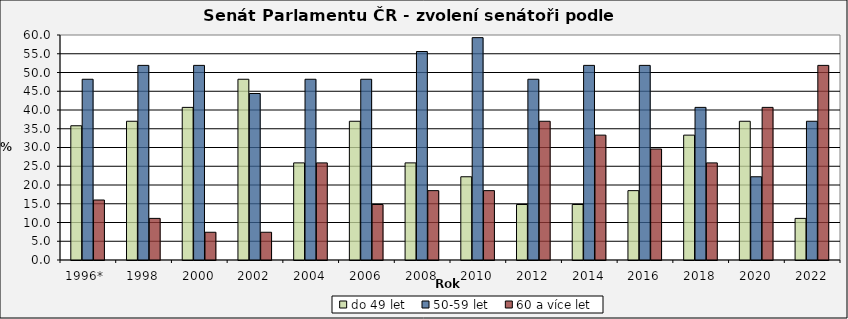
| Category | do 49 let | 50-59 let | 60 a více let |
|---|---|---|---|
| 1996*  | 35.8 | 48.2 | 16 |
| 1998 | 37 | 51.9 | 11.1 |
| 2000 | 40.7 | 51.9 | 7.4 |
| 2002 | 48.2 | 44.4 | 7.4 |
| 2004 | 25.9 | 48.2 | 25.9 |
| 2006 | 37 | 48.2 | 14.8 |
| 2008 | 25.9 | 55.6 | 18.5 |
| 2010 | 22.2 | 59.3 | 18.5 |
| 2012 | 14.8 | 48.2 | 37 |
| 2014 | 14.8 | 51.9 | 33.3 |
| 2016 | 18.5 | 51.9 | 29.6 |
| 2018 | 33.3 | 40.7 | 25.9 |
| 2020 | 37 | 22.2 | 40.7 |
| 2022 | 11.1 | 37 | 51.9 |